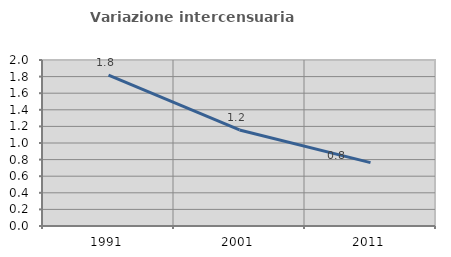
| Category | Variazione intercensuaria annua |
|---|---|
| 1991.0 | 1.819 |
| 2001.0 | 1.157 |
| 2011.0 | 0.764 |